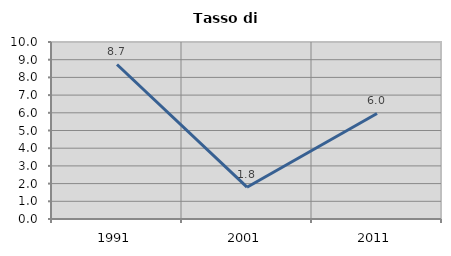
| Category | Tasso di disoccupazione   |
|---|---|
| 1991.0 | 8.73 |
| 2001.0 | 1.796 |
| 2011.0 | 5.962 |